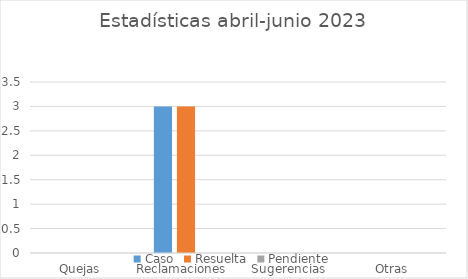
| Category | Caso | Resuelta | Pendiente |
|---|---|---|---|
| Quejas | 0 | 0 | 0 |
| Reclamaciones  | 3 | 3 | 0 |
| Sugerencias | 0 | 0 | 0 |
| Otras | 0 | 0 | 0 |